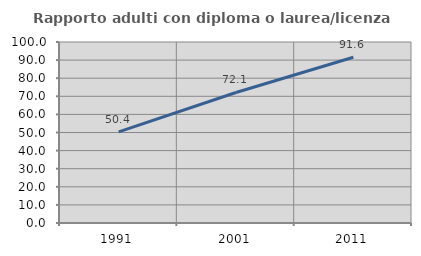
| Category | Rapporto adulti con diploma o laurea/licenza media  |
|---|---|
| 1991.0 | 50.386 |
| 2001.0 | 72.122 |
| 2011.0 | 91.586 |